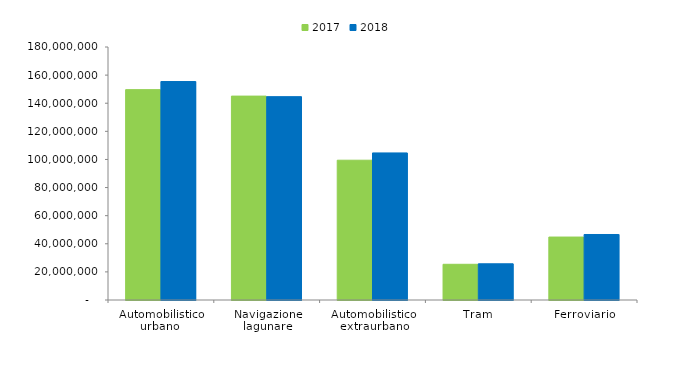
| Category | 2017 | 2018 |
|---|---|---|
| Automobilistico urbano  | 149671039 | 155427954.45 |
| Navigazione lagunare | 145071060 | 144663605 |
| Automobilistico extraurbano | 99454334.05 | 104638018.65 |
| Tram | 25406312 | 25748679 |
| Ferroviario | 44779685 | 46605536 |